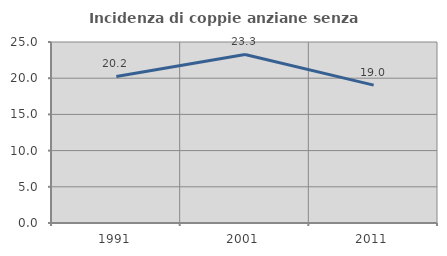
| Category | Incidenza di coppie anziane senza figli  |
|---|---|
| 1991.0 | 20.243 |
| 2001.0 | 23.276 |
| 2011.0 | 19.048 |